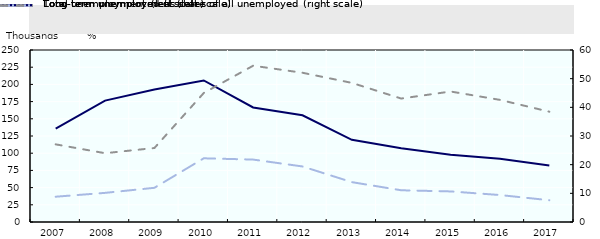
| Category | Total duration (Thousands – left scale) | Long-term duration (Thousands – left scale) |
|---|---|---|
| 2007.0 | 135.71 | 36.757 |
| 2008.0 | 176.427 | 42.336 |
| 2009.0 | 192.557 | 49.703 |
| 2010.0 | 205.737 | 92.587 |
| 2011.0 | 166.432 | 90.732 |
| 2012.0 | 155.052 | 80.721 |
| 2013.0 | 119.392 | 57.941 |
| 2014.0 | 107.09 | 46.119 |
| 2015.0 | 97.625 | 44.438 |
| 2016.0 | 92.002 | 39.194 |
| 2017.0 | 82.256 | 31.652 |